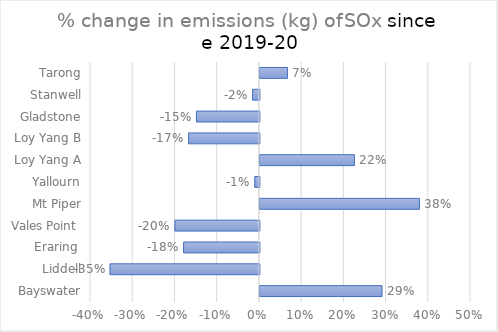
| Category | Series 0 |
|---|---|
| Bayswater | 0.289 |
| Liddell | -0.354 |
|  Eraring  | -0.179 |
| Vales Point  | -0.2 |
| Mt Piper | 0.378 |
| Yallourn | -0.011 |
| Loy Yang A | 0.224 |
| Loy Yang B | -0.168 |
| Gladstone | -0.149 |
| Stanwell | -0.016 |
| Tarong | 0.065 |